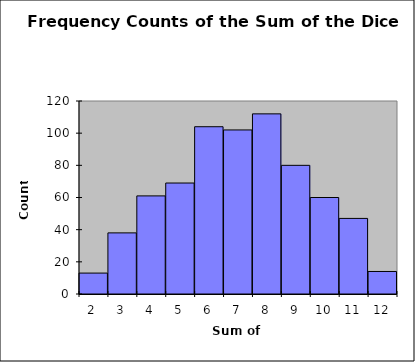
| Category | Series 0 |
|---|---|
| 2.0 | 13 |
| 3.0 | 38 |
| 4.0 | 61 |
| 5.0 | 69 |
| 6.0 | 104 |
| 7.0 | 102 |
| 8.0 | 112 |
| 9.0 | 80 |
| 10.0 | 60 |
| 11.0 | 47 |
| 12.0 | 14 |